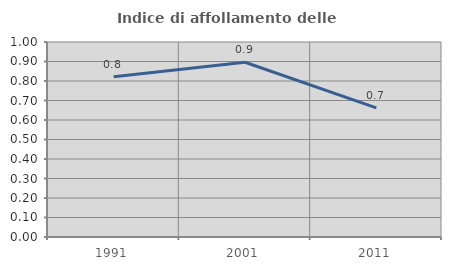
| Category | Indice di affollamento delle abitazioni  |
|---|---|
| 1991.0 | 0.821 |
| 2001.0 | 0.896 |
| 2011.0 | 0.662 |